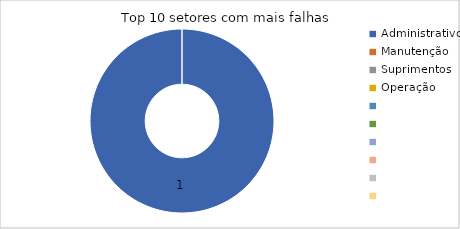
| Category | Total |
|---|---|
| Administrativo | 1 |
| Manutenção | 0 |
| Suprimentos | 0 |
| Operação | 0 |